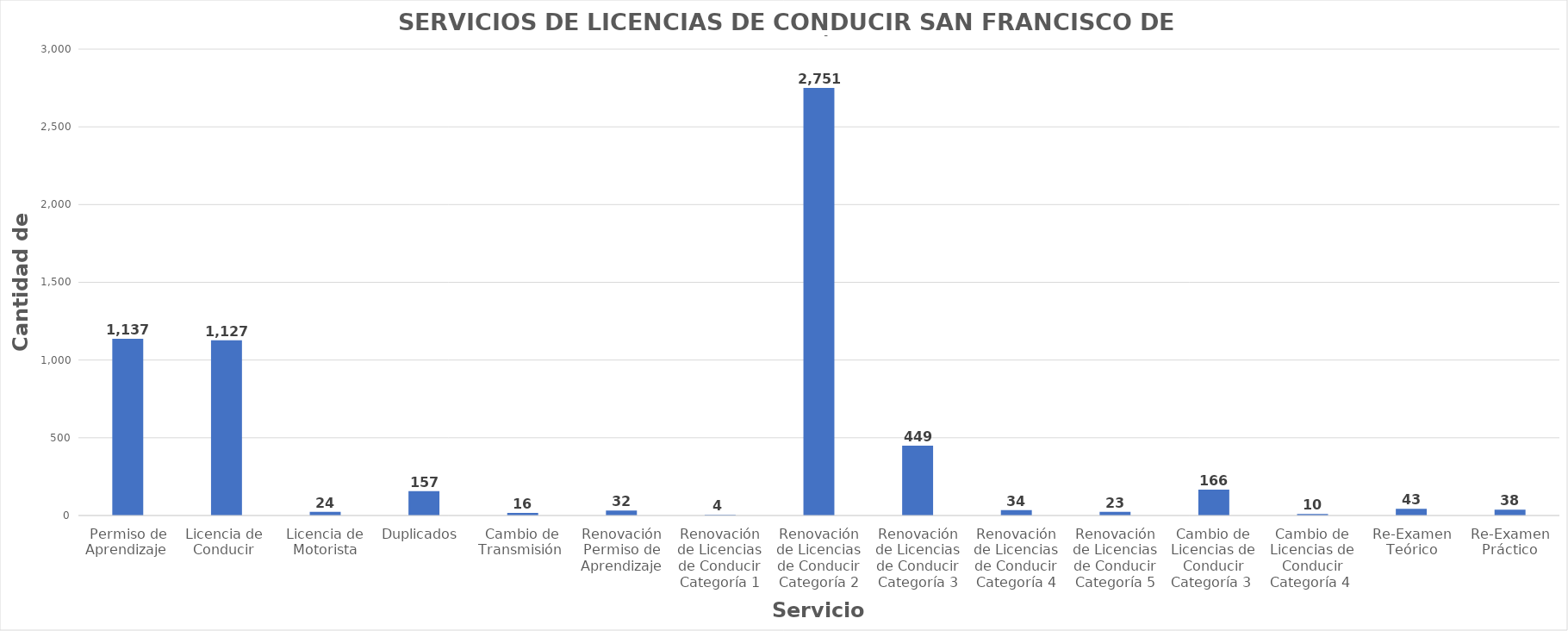
| Category | Series 0 |
|---|---|
| Permiso de Aprendizaje  | 1137 |
| Licencia de  Conducir  | 1127 |
| Licencia de Motorista | 24 |
| Duplicados  | 157 |
| Cambio de Transmisión  | 16 |
| Renovación Permiso de Aprendizaje | 32 |
| Renovación de Licencias de Conducir Categoría 1 | 4 |
| Renovación de Licencias de Conducir Categoría 2 | 2751 |
| Renovación de Licencias de Conducir Categoría 3 | 449 |
| Renovación de Licencias de Conducir Categoría 4 | 34 |
| Renovación de Licencias de Conducir Categoría 5 | 23 |
| Cambio de Licencias de Conducir Categoría 3  | 166 |
| Cambio de Licencias de Conducir Categoría 4  | 10 |
| Re-Examen Teórico | 43 |
| Re-Examen Práctico | 38 |